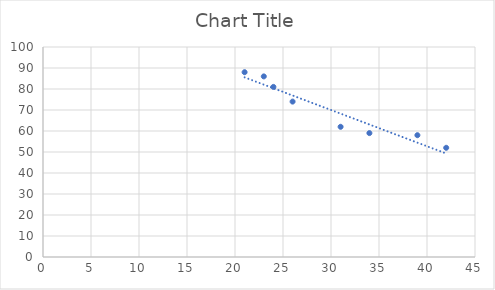
| Category | Series 0 |
|---|---|
| 21.0 | 88 |
| 23.0 | 86 |
| 24.0 | 81 |
| 26.0 | 74 |
| 31.0 | 62 |
| 34.0 | 59 |
| 39.0 | 58 |
| 42.0 | 52 |